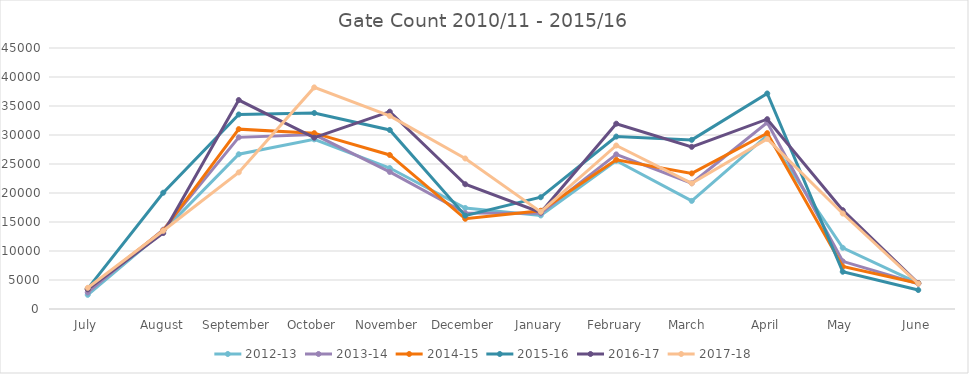
| Category | 2012-13 | 2013-14 | 2014-15 | 2015-16 | 2016-17 | 2017-18 |
|---|---|---|---|---|---|---|
| July | 2445 | 2853 | 3427 | 3506 | 3392 | 3653 |
| August | 13422 | 13673 | 13530 | 20050 | 13096 | 13479 |
| September | 26680 | 29591 | 31012 | 33538 | 36026 | 23551 |
| October | 29248 | 30066 | 30320 | 33791 | 29537 | 38209 |
| November | 24303 | 23633 | 26556 | 30869 | 34023 | 33287 |
| December | 17415 | 16531 | 15551 | 16096 | 21512 | 25951 |
| January | 16129 | 16495 | 16941 | 19271 | 16654 | 16743 |
| February | 25554 | 26660 | 25731 | 29730 | 31949 | 28193 |
| March  | 18638 | 21683 | 23376 | 29158 | 27959 | 21661 |
| April | 29919 | 32147 | 30320 | 37159 | 32727 | 29310 |
| May | 10547 | 8219 | 7321 | 6424 | 17041 | 16462 |
| June | 4445 | 4361 | 4453 | 3273 | 4431 | 4374 |